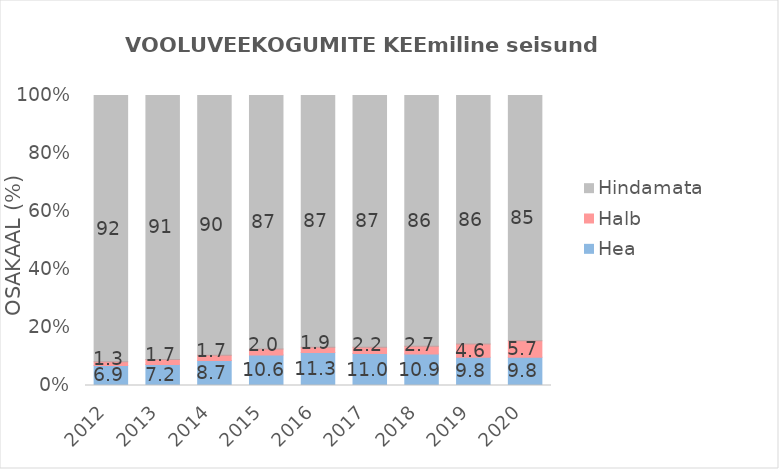
| Category | Hea  | Halb | Hindamata |
|---|---|---|---|
| 2012.0 | 6.929 | 1.26 | 91.811 |
| 2013.0 | 7.244 | 1.732 | 91.024 |
| 2014.0 | 8.661 | 1.732 | 89.606 |
| 2015.0 | 10.551 | 2.047 | 87.402 |
| 2016.0 | 11.339 | 1.89 | 86.772 |
| 2017.0 | 11.024 | 2.205 | 86.772 |
| 2018.0 | 10.866 | 2.677 | 86.457 |
| 2019.0 | 9.764 | 4.567 | 85.669 |
| 2020.0 | 9.764 | 5.669 | 84.567 |